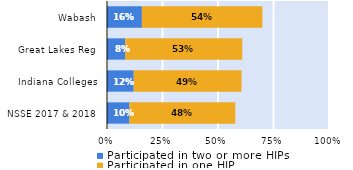
| Category | Participated in two or more HIPs | Participated in one HIP |
|---|---|---|
| NSSE 2017 & 2018 | 0.101 | 0.477 |
| Indiana Colleges | 0.12 | 0.486 |
| Great Lakes Reg | 0.082 | 0.527 |
| Wabash | 0.157 | 0.543 |